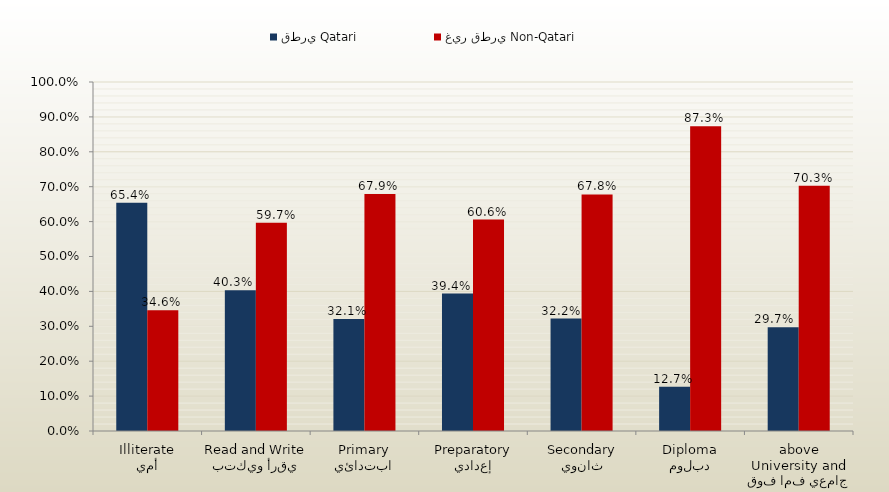
| Category | قطري Qatari | غير قطري Non-Qatari |
|---|---|---|
| أمي
Illiterate | 0.654 | 0.346 |
| يقرأ ويكتب
Read and Write | 0.403 | 0.597 |
| ابتدائي
Primary | 0.321 | 0.679 |
| إعدادي
Preparatory | 0.394 | 0.606 |
| ثانوي
Secondary | 0.322 | 0.678 |
| دبلوم
Diploma | 0.127 | 0.873 |
| جامعي فما فوق
University and above | 0.297 | 0.703 |